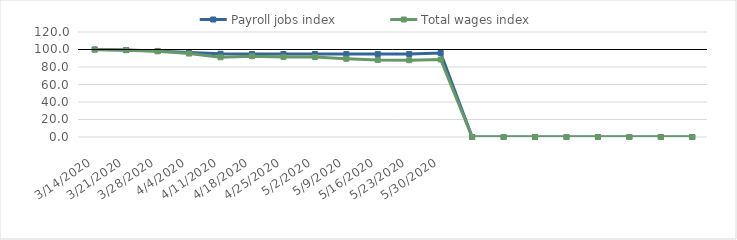
| Category | Payroll jobs index | Total wages index |
|---|---|---|
| 14/03/2020 | 100 | 100 |
| 21/03/2020 | 99.437 | 99.213 |
| 28/03/2020 | 98.333 | 97.971 |
| 04/04/2020 | 96.708 | 95.362 |
| 11/04/2020 | 95.143 | 91.154 |
| 18/04/2020 | 94.883 | 92.333 |
| 25/04/2020 | 94.807 | 91.555 |
| 02/05/2020 | 94.863 | 91.425 |
| 09/05/2020 | 94.765 | 89.388 |
| 16/05/2020 | 94.745 | 88.084 |
| 23/05/2020 | 94.921 | 87.776 |
| 30/05/2020 | 96.019 | 88.594 |